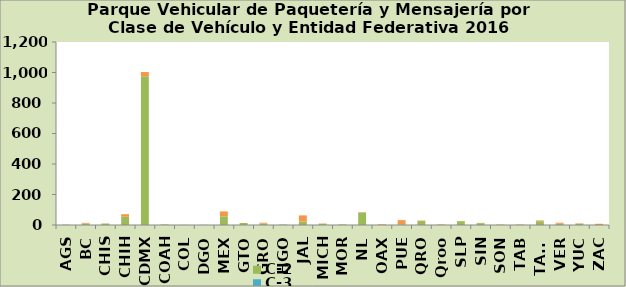
| Category | C-2 | C-3 | Camioneta |
|---|---|---|---|
| AGS | 2 | 0 | 0 |
| BC | 9 | 0 | 5 |
| CHIS | 10 | 0 | 0 |
| CHIH | 54 | 0 | 17 |
| CDMX | 975 | 0 | 28 |
| COAH | 3 | 0 | 1 |
| COL | 1 | 0 | 0 |
| DGO | 1 | 0 | 0 |
| MEX | 57 | 0 | 32 |
| GTO | 13 | 0 | 0 |
| GRO | 9 | 0 | 6 |
| HGO | 2 | 1 | 0 |
| JAL | 23 | 0 | 40 |
| MICH | 8 | 0 | 2 |
| MOR | 3 | 0 | 1 |
| NL | 82 | 0 | 2 |
| OAX | 1 | 0 | 4 |
| PUE | 5 | 0 | 27 |
| QRO | 26 | 0 | 3 |
| Qroo | 1 | 0 | 3 |
| SLP | 25 | 0 | 1 |
| SIN | 12 | 0 | 2 |
| SON | 0 | 0 | 3 |
| TAB | 0 | 0 | 3 |
| TAMS | 25 | 0 | 5 |
| VER | 7 | 1 | 7 |
| YUC | 9 | 0 | 2 |
| ZAC | 0 | 0 | 8 |